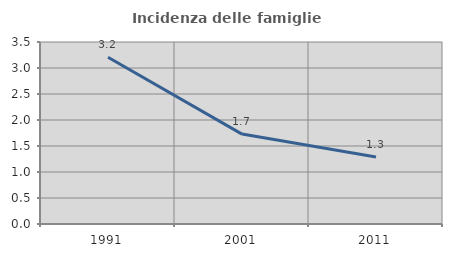
| Category | Incidenza delle famiglie numerose |
|---|---|
| 1991.0 | 3.206 |
| 2001.0 | 1.729 |
| 2011.0 | 1.287 |